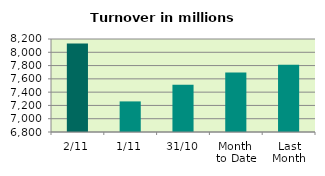
| Category | Series 0 |
|---|---|
| 2/11 | 8133.235 |
| 1/11 | 7260.547 |
| 31/10 | 7511.726 |
| Month 
to Date | 7696.891 |
| Last
Month | 7813.06 |